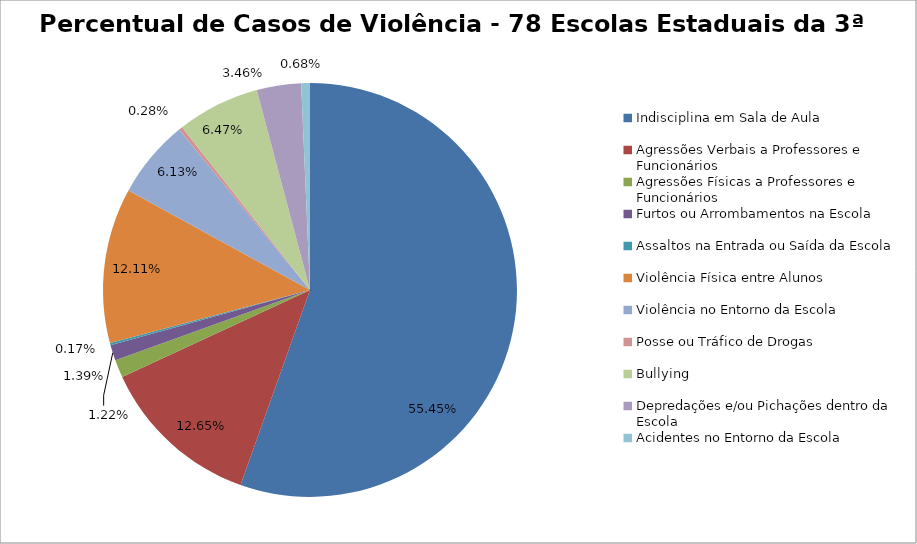
| Category | Percentual |
|---|---|
| Indisciplina em Sala de Aula | 0.554 |
| Agressões Verbais a Professores e Funcionários | 0.126 |
| Agressões Físicas a Professores e Funcionários | 0.014 |
| Furtos ou Arrombamentos na Escola | 0.012 |
| Assaltos na Entrada ou Saída da Escola | 0.002 |
| Violência Física entre Alunos | 0.121 |
| Violência no Entorno da Escola | 0.061 |
| Posse ou Tráfico de Drogas | 0.003 |
| Bullying | 0.065 |
| Depredações e/ou Pichações dentro da Escola | 0.035 |
| Acidentes no Entorno da Escola | 0.007 |